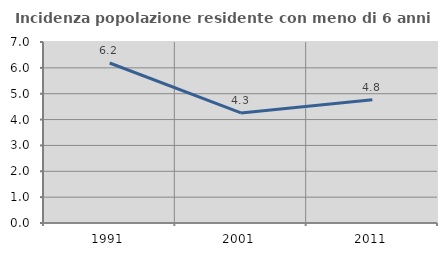
| Category | Incidenza popolazione residente con meno di 6 anni |
|---|---|
| 1991.0 | 6.188 |
| 2001.0 | 4.255 |
| 2011.0 | 4.764 |